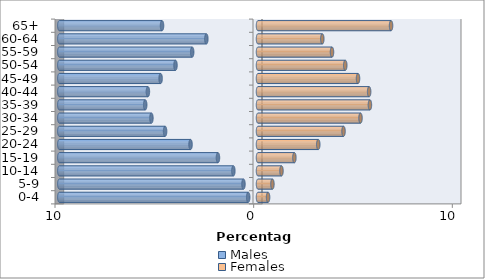
| Category | Males | Females |
|---|---|---|
| 0-4 | -0.493 | 0.507 |
| 5-9 | -0.732 | 0.726 |
| 10-14 | -1.24 | 1.182 |
| 15-19 | -2.016 | 1.831 |
| 20-24 | -3.396 | 3.034 |
| 25-29 | -4.677 | 4.305 |
| 30-34 | -5.365 | 5.16 |
| 35-39 | -5.678 | 5.634 |
| 40-44 | -5.542 | 5.595 |
| 45-49 | -4.902 | 5.035 |
| 50-54 | -4.154 | 4.393 |
| 55-59 | -3.313 | 3.725 |
| 60-64 | -2.6 | 3.237 |
| 65+ | -4.831 | 6.697 |